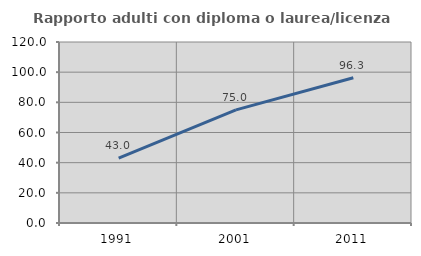
| Category | Rapporto adulti con diploma o laurea/licenza media  |
|---|---|
| 1991.0 | 43.023 |
| 2001.0 | 75 |
| 2011.0 | 96.341 |